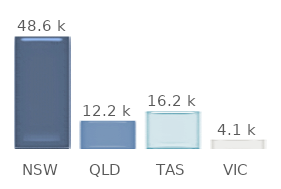
| Category | Series 0 |
|---|---|
| NSW | 48.6 |
| QLD | 12.15 |
| TAS | 16.2 |
| VIC | 4.05 |